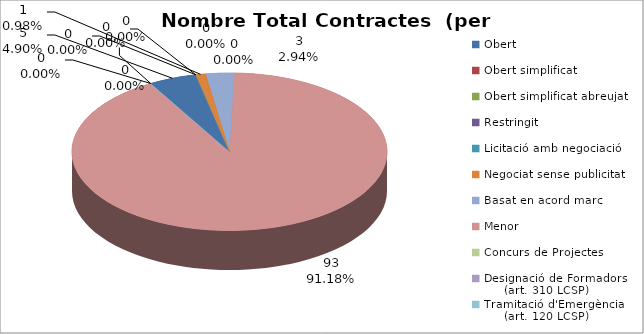
| Category | Nombre Total Contractes |
|---|---|
| Obert | 5 |
| Obert simplificat | 0 |
| Obert simplificat abreujat | 0 |
| Restringit | 0 |
| Licitació amb negociació | 0 |
| Negociat sense publicitat | 1 |
| Basat en acord marc | 3 |
| Menor | 93 |
| Concurs de Projectes | 0 |
| Designació de Formadors
     (art. 310 LCSP) | 0 |
| Tramitació d'Emergència
     (art. 120 LCSP) | 0 |